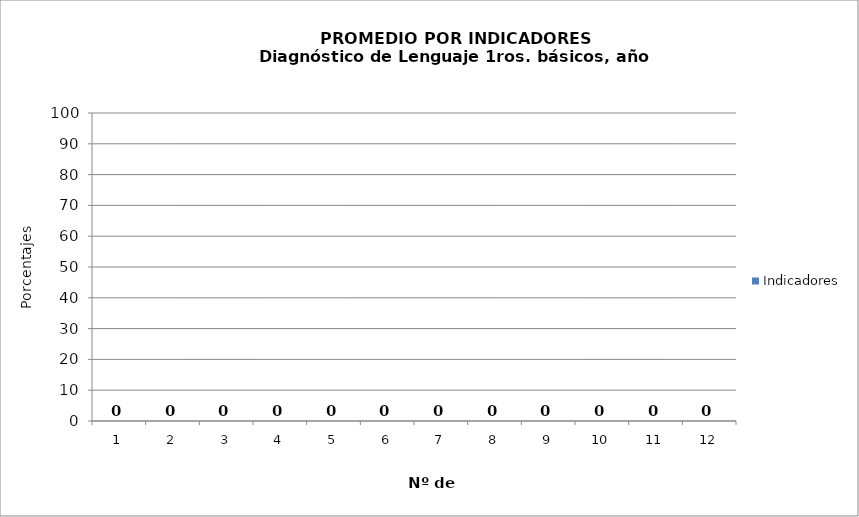
| Category | Indicadores |
|---|---|
| 0 | 0 |
| 1 | 0 |
| 2 | 0 |
| 3 | 0 |
| 4 | 0 |
| 5 | 0 |
| 6 | 0 |
| 7 | 0 |
| 8 | 0 |
| 9 | 0 |
| 10 | 0 |
| 11 | 0 |